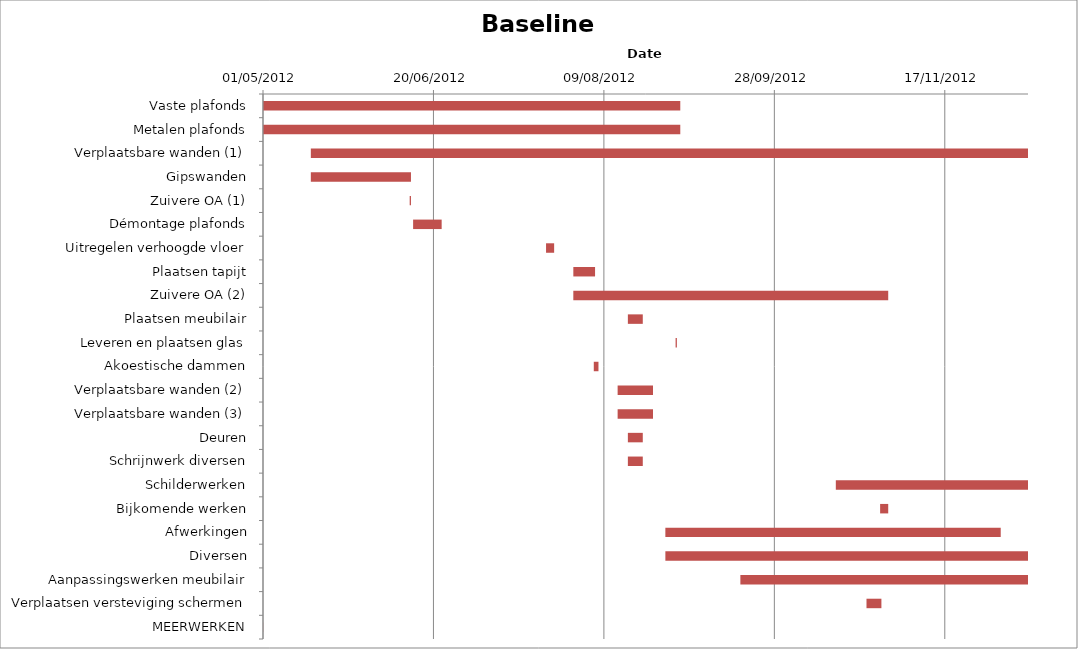
| Category | Baseline start | Actual duration |
|---|---|---|
| Vaste plafonds | 41030.333 | 122.375 |
| Metalen plafonds | 41030.333 | 122.375 |
| Verplaatsbare wanden (1) | 41044.333 | 210.375 |
| Gipswanden | 41044.333 | 29.375 |
| Zuivere OA (1) | 41073.333 | 0.375 |
| Démontage plafonds | 41074.333 | 8.375 |
| Uitregelen verhoogde vloer | 41113.333 | 2.375 |
| Plaatsen tapijt | 41121.333 | 6.375 |
| Zuivere OA (2) | 41121.333 | 92.375 |
| Plaatsen meubilair | 41137.333 | 4.375 |
| Leveren en plaatsen glas | 41151.333 | 0.375 |
| Akoestische dammen | 41127.333 | 1.375 |
| Verplaatsbare wanden (2) | 41134.333 | 10.375 |
| Verplaatsbare wanden (3) | 41134.333 | 10.375 |
| Deuren | 41137.333 | 4.375 |
| Schrijnwerk diversen | 41137.333 | 4.375 |
| Schilderwerken | 41198.333 | 56.375 |
| Bijkomende werken | 41211.333 | 2.375 |
| Afwerkingen | 41148.333 | 98.375 |
| Diversen | 41148.333 | 106.375 |
| Aanpassingswerken meubilair | 41170.333 | 84.375 |
| Verplaatsen versteviging schermen | 41207.333 | 4.375 |
| MEERWERKEN | 41030.333 | 0.042 |